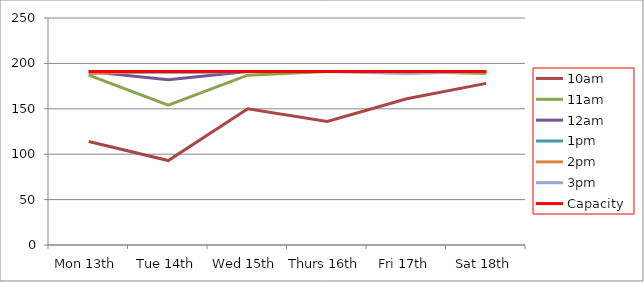
| Category | 9am | 10am | 11am | 12am | 1pm | 2pm | 3pm | 4pm | 5pm | Capacity |
|---|---|---|---|---|---|---|---|---|---|---|
| Mon 13th |  | 114 | 187 | 191 | 191 | 189 | 191 |  |  | 191 |
| Tue 14th |  | 93 | 154 | 182 | 190 | 191 | 190 |  |  | 191 |
| Wed 15th |  | 150 | 187 | 191 | 191 | 191 | 191 |  |  | 191 |
| Thurs 16th |  | 136 | 191 | 191 | 191 | 191 | 191 |  |  | 191 |
| Fri 17th |  | 161 | 191 | 191 | 191 | 191 | 189 |  |  | 191 |
| Sat 18th |  | 178 | 189 | 191 | 191 | 191 | 191 |  |  | 191 |